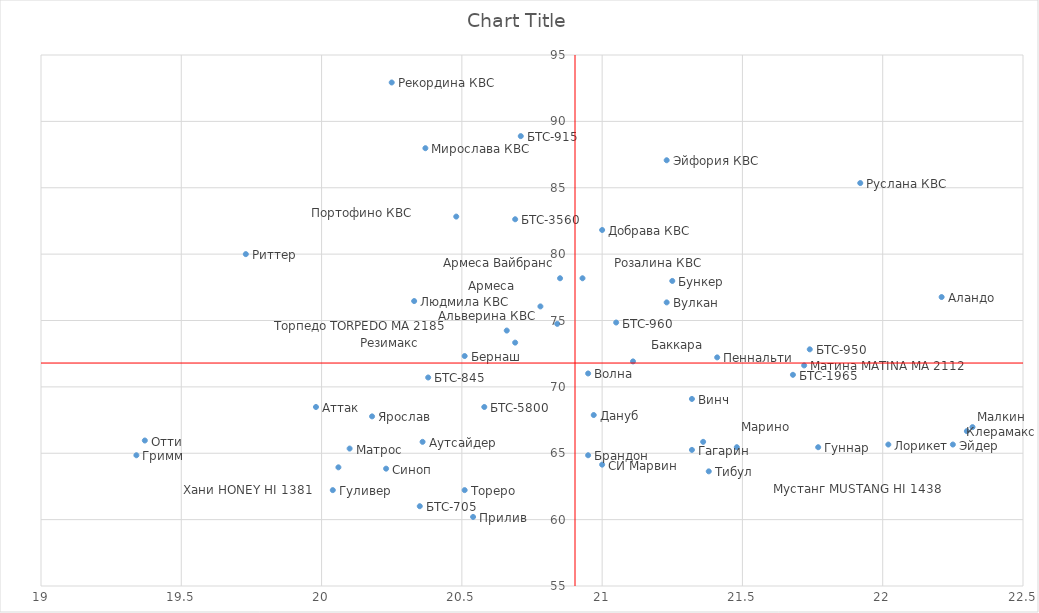
| Category | Series 0 |
|---|---|
| 20.25 | 92.929 |
| 21.0 | 81.818 |
| 21.23 | 87.071 |
| 21.92 | 85.354 |
| 20.84 | 74.747 |
| 20.33 | 76.465 |
| 20.93 | 78.182 |
| 20.37 | 87.98 |
| 20.48 | 82.828 |
| 20.71 | 88.889 |
| 20.38 | 70.707 |
| 21.74 | 72.828 |
| 20.69 | 82.626 |
| 20.58 | 68.485 |
| 21.68 | 70.909 |
| 21.05 | 74.848 |
| 20.35 | 61.01 |
| 20.85 | 78.182 |
| 21.38 | 63.636 |
| 22.32 | 66.97 |
| 20.18 | 67.778 |
| 21.32 | 65.253 |
| 20.04 | 62.222 |
| 21.77 | 65.455 |
| 19.34 | 64.848 |
| 20.36 | 65.859 |
| 21.25 | 77.98 |
| 21.32 | 69.091 |
| 20.51 | 72.323 |
| 22.3 | 66.667 |
| 19.37 | 65.96 |
| 20.97 | 67.879 |
| 21.41 | 72.222 |
| 21.11 | 71.919 |
| 20.69 | 73.333 |
| 22.02 | 65.657 |
| 22.25 | 65.657 |
| 21.48 | 65.455 |
| 19.98 | 68.485 |
| 20.95 | 64.848 |
| 20.06 | 63.939 |
| 20.51 | 62.222 |
| 20.66 | 74.242 |
| 21.72 | 71.616 |
| 19.73 | 80 |
| 20.78 | 76.061 |
| 21.0 | 64.141 |
| 20.1 | 65.354 |
| 20.23 | 63.838 |
| 21.36 | 65.859 |
| 22.21 | 76.768 |
| 21.23 | 76.364 |
| 20.95 | 71.01 |
| 20.54 | 60.202 |